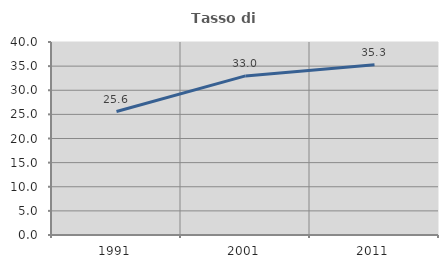
| Category | Tasso di occupazione   |
|---|---|
| 1991.0 | 25.587 |
| 2001.0 | 32.977 |
| 2011.0 | 35.307 |